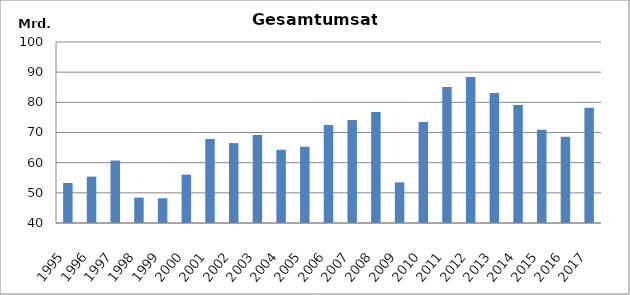
| Category | 1995 1996 1997 1998 1999 2000 2001 2002 2003 2004 2005 2006 2007 2008 2009 2010 2011 2012 2013 2014 2015 2016 2017 |
|---|---|
| 1995 | 53278763 |
| 1996 | 55371956 |
| 1997 | 60710454 |
| 1998 | 48430705 |
| 1999 | 48190293 |
| 2000 | 56014702 |
| 2001 | 67861795 |
| 2002 | 66481294 |
| 2003 | 69161973 |
| 2004 | 64266307 |
| 2005 | 65293897 |
| 2006 | 72514648 |
| 2007 | 74176770 |
| 2008 | 76788139 |
| 2009 | 53462495 |
| 2010 | 73497409.496 |
| 2011 | 85064473 |
| 2012 | 88419481 |
| 2013 | 83060160 |
| 2014 | 79153644 |
| 2015 | 70914314 |
| 2016 | 68567351 |
| 2017 | 78171436 |